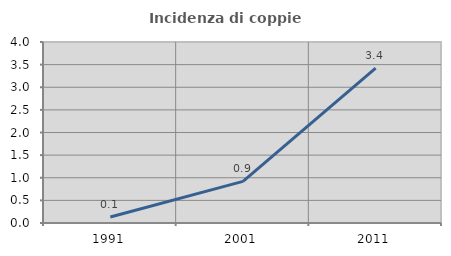
| Category | Incidenza di coppie miste |
|---|---|
| 1991.0 | 0.132 |
| 2001.0 | 0.919 |
| 2011.0 | 3.423 |